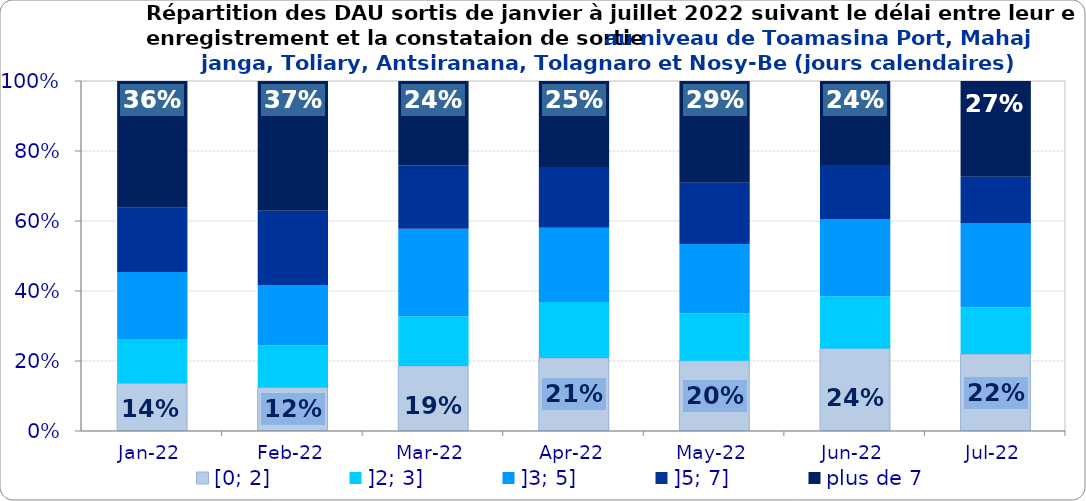
| Category | [0; 2] | ]2; 3] | ]3; 5] | ]5; 7] | plus de 7 |
|---|---|---|---|---|---|
| 2022-01-01 | 0.136 | 0.127 | 0.191 | 0.184 | 0.362 |
| 2022-02-01 | 0.124 | 0.12 | 0.172 | 0.213 | 0.371 |
| 2022-03-01 | 0.186 | 0.142 | 0.25 | 0.182 | 0.241 |
| 2022-04-01 | 0.209 | 0.16 | 0.212 | 0.173 | 0.246 |
| 2022-05-01 | 0.201 | 0.135 | 0.199 | 0.175 | 0.29 |
| 2022-06-01 | 0.236 | 0.149 | 0.219 | 0.156 | 0.24 |
| 2022-07-01 | 0.22 | 0.134 | 0.239 | 0.133 | 0.274 |